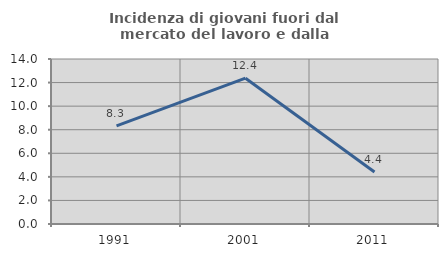
| Category | Incidenza di giovani fuori dal mercato del lavoro e dalla formazione  |
|---|---|
| 1991.0 | 8.333 |
| 2001.0 | 12.371 |
| 2011.0 | 4.412 |